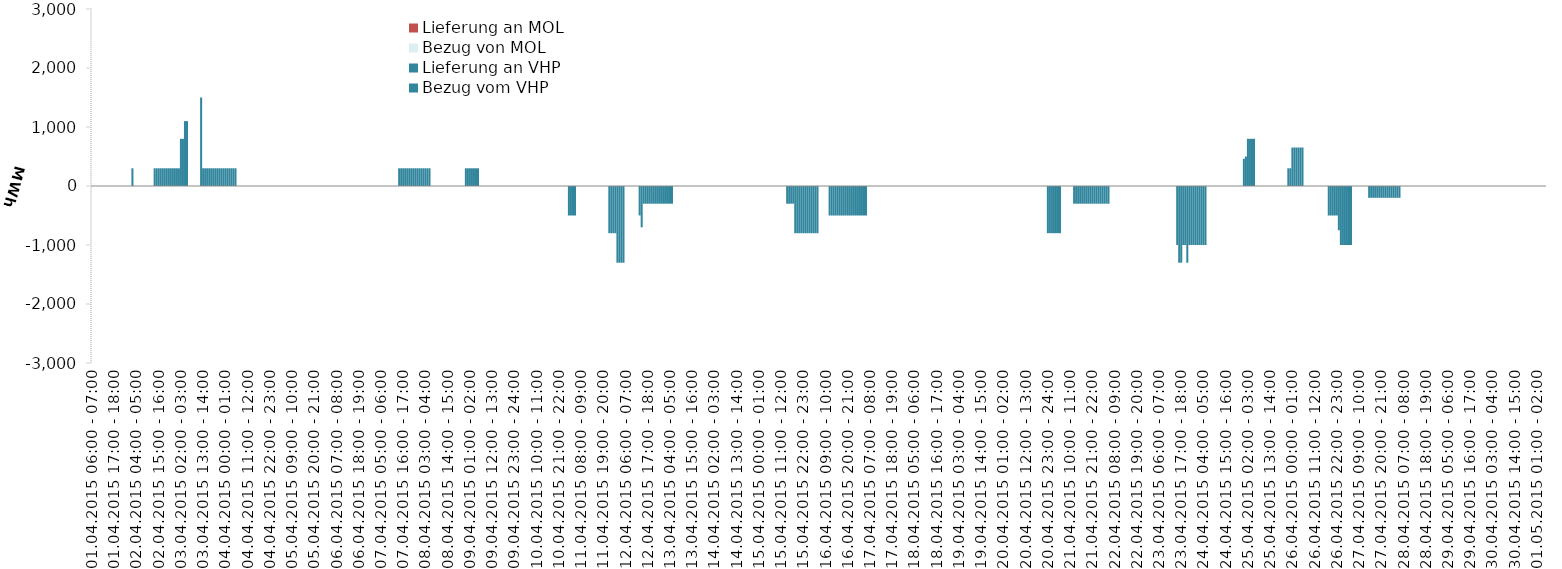
| Category | Bezug vom VHP | Lieferung an VHP | Bezug von MOL | Lieferung an MOL |
|---|---|---|---|---|
| 01.04.2015 06:00 - 07:00 | 0 | 0 | 0 | 0 |
| 01.04.2015 07:00 - 08:00 | 0 | 0 | 0 | 0 |
| 01.04.2015 08:00 - 09:00 | 0 | 0 | 0 | 0 |
| 01.04.2015 09:00 - 10:00 | 0 | 0 | 0 | 0 |
| 01.04.2015 10:00 - 11:00 | 0 | 0 | 0 | 0 |
| 01.04.2015 11:00 - 12:00 | 0 | 0 | 0 | 0 |
| 01.04.2015 12:00 - 13:00 | 0 | 0 | 0 | 0 |
| 01.04.2015 13:00 - 14:00 | 0 | 0 | 0 | 0 |
| 01.04.2015 14:00 - 15:00 | 0 | 0 | 0 | 0 |
| 01.04.2015 15:00 - 16:00 | 0 | 0 | 0 | 0 |
| 01.04.2015 16:00 - 17:00 | 0 | 0 | 0 | 0 |
| 01.04.2015 17:00 - 18:00 | 0 | 0 | 0 | 0 |
| 01.04.2015 18:00 - 19:00 | 0 | 0 | 0 | 0 |
| 01.04.2015 19:00 - 20:00 | 0 | 0 | 0 | 0 |
| 01.04.2015 20:00 - 21:00 | 0 | 0 | 0 | 0 |
| 01.04.2015 21:00 - 22:00 | 0 | 0 | 0 | 0 |
| 01.04.2015 22:00 - 23:00 | 0 | 0 | 0 | 0 |
| 01.04.2015 23:00 - 24:00 | 0 | 0 | 0 | 0 |
| 02.04.2015 00:00 - 01:00 | 0 | 0 | 0 | 0 |
| 02.04.2015 01:00 - 02:00 | 0 | 0 | 0 | 0 |
| 02.04.2015 02:00 - 03:00 | 300 | 0 | 0 | 0 |
| 02.04.2015 03:00 - 04:00 | 0 | 0 | 0 | 0 |
| 02.04.2015 04:00 - 05:00 | 0 | 0 | 0 | 0 |
| 02.04.2015 05:00 - 06:00 | 0 | 0 | 0 | 0 |
| 02.04.2015 06:00 - 07:00 | 0 | 0 | 0 | 0 |
| 02.04.2015 07:00 - 08:00 | 0 | 0 | 0 | 0 |
| 02.04.2015 08:00 - 09:00 | 0 | 0 | 0 | 0 |
| 02.04.2015 09:00 - 10:00 | 0 | 0 | 0 | 0 |
| 02.04.2015 10:00 - 11:00 | 0 | 0 | 0 | 0 |
| 02.04.2015 11:00 - 12:00 | 0 | 0 | 0 | 0 |
| 02.04.2015 12:00 - 13:00 | 0 | 0 | 0 | 0 |
| 02.04.2015 13:00 - 14:00 | 300 | 0 | 0 | 0 |
| 02.04.2015 14:00 - 15:00 | 300 | 0 | 0 | 0 |
| 02.04.2015 15:00 - 16:00 | 300 | 0 | 0 | 0 |
| 02.04.2015 16:00 - 17:00 | 300 | 0 | 0 | 0 |
| 02.04.2015 17:00 - 18:00 | 300 | 0 | 0 | 0 |
| 02.04.2015 18:00 - 19:00 | 300 | 0 | 0 | 0 |
| 02.04.2015 19:00 - 20:00 | 300 | 0 | 0 | 0 |
| 02.04.2015 20:00 - 21:00 | 300 | 0 | 0 | 0 |
| 02.04.2015 21:00 - 22:00 | 300 | 0 | 0 | 0 |
| 02.04.2015 22:00 - 23:00 | 300 | 0 | 0 | 0 |
| 02.04.2015 23:00 - 24:00 | 300 | 0 | 0 | 0 |
| 03.04.2015 00:00 - 01:00 | 300 | 0 | 0 | 0 |
| 03.04.2015 01:00 - 02:00 | 300 | 0 | 0 | 0 |
| 03.04.2015 02:00 - 03:00 | 800 | 0 | 0 | 0 |
| 03.04.2015 03:00 - 04:00 | 800 | 0 | 0 | 0 |
| 03.04.2015 04:00 - 05:00 | 1100 | 0 | 0 | 0 |
| 03.04.2015 05:00 - 06:00 | 1100 | 0 | 0 | 0 |
| 03.04.2015 06:00 - 07:00 | 0 | 0 | 0 | 0 |
| 03.04.2015 07:00 - 08:00 | 0 | 0 | 0 | 0 |
| 03.04.2015 08:00 - 09:00 | 0 | 0 | 0 | 0 |
| 03.04.2015 09:00 - 10:00 | 0 | 0 | 0 | 0 |
| 03.04.2015 10:00 - 11:00 | 0 | 0 | 0 | 0 |
| 03.04.2015 11:00 - 12:00 | 0 | 0 | 0 | 0 |
| 03.04.2015 12:00 - 13:00 | 1500 | 0 | 0 | 0 |
| 03.04.2015 13:00 - 14:00 | 300 | 0 | 0 | 0 |
| 03.04.2015 14:00 - 15:00 | 300 | 0 | 0 | 0 |
| 03.04.2015 15:00 - 16:00 | 300 | 0 | 0 | 0 |
| 03.04.2015 16:00 - 17:00 | 300 | 0 | 0 | 0 |
| 03.04.2015 17:00 - 18:00 | 300 | 0 | 0 | 0 |
| 03.04.2015 18:00 - 19:00 | 300 | 0 | 0 | 0 |
| 03.04.2015 19:00 - 20:00 | 300 | 0 | 0 | 0 |
| 03.04.2015 20:00 - 21:00 | 300 | 0 | 0 | 0 |
| 03.04.2015 21:00 - 22:00 | 300 | 0 | 0 | 0 |
| 03.04.2015 22:00 - 23:00 | 300 | 0 | 0 | 0 |
| 03.04.2015 23:00 - 24:00 | 300 | 0 | 0 | 0 |
| 04.04.2015 00:00 - 01:00 | 300 | 0 | 0 | 0 |
| 04.04.2015 01:00 - 02:00 | 300 | 0 | 0 | 0 |
| 04.04.2015 02:00 - 03:00 | 300 | 0 | 0 | 0 |
| 04.04.2015 03:00 - 04:00 | 300 | 0 | 0 | 0 |
| 04.04.2015 04:00 - 05:00 | 300 | 0 | 0 | 0 |
| 04.04.2015 05:00 - 06:00 | 300 | 0 | 0 | 0 |
| 04.04.2015 06:00 - 07:00 | 0 | 0 | 0 | 0 |
| 04.04.2015 07:00 - 08:00 | 0 | 0 | 0 | 0 |
| 04.04.2015 08:00 - 09:00 | 0 | 0 | 0 | 0 |
| 04.04.2015 09:00 - 10:00 | 0 | 0 | 0 | 0 |
| 04.04.2015 10:00 - 11:00 | 0 | 0 | 0 | 0 |
| 04.04.2015 11:00 - 12:00 | 0 | 0 | 0 | 0 |
| 04.04.2015 12:00 - 13:00 | 0 | 0 | 0 | 0 |
| 04.04.2015 13:00 - 14:00 | 0 | 0 | 0 | 0 |
| 04.04.2015 14:00 - 15:00 | 0 | 0 | 0 | 0 |
| 04.04.2015 15:00 - 16:00 | 0 | 0 | 0 | 0 |
| 04.04.2015 16:00 - 17:00 | 0 | 0 | 0 | 0 |
| 04.04.2015 17:00 - 18:00 | 0 | 0 | 0 | 0 |
| 04.04.2015 18:00 - 19:00 | 0 | 0 | 0 | 0 |
| 04.04.2015 19:00 - 20:00 | 0 | 0 | 0 | 0 |
| 04.04.2015 20:00 - 21:00 | 0 | 0 | 0 | 0 |
| 04.04.2015 21:00 - 22:00 | 0 | 0 | 0 | 0 |
| 04.04.2015 22:00 - 23:00 | 0 | 0 | 0 | 0 |
| 04.04.2015 23:00 - 24:00 | 0 | 0 | 0 | 0 |
| 05.04.2015 00:00 - 01:00 | 0 | 0 | 0 | 0 |
| 05.04.2015 01:00 - 02:00 | 0 | 0 | 0 | 0 |
| 05.04.2015 02:00 - 03:00 | 0 | 0 | 0 | 0 |
| 05.04.2015 03:00 - 04:00 | 0 | 0 | 0 | 0 |
| 05.04.2015 04:00 - 05:00 | 0 | 0 | 0 | 0 |
| 05.04.2015 05:00 - 06:00 | 0 | 0 | 0 | 0 |
| 05.04.2015 06:00 - 07:00 | 0 | 0 | 0 | 0 |
| 05.04.2015 07:00 - 08:00 | 0 | 0 | 0 | 0 |
| 05.04.2015 08:00 - 09:00 | 0 | 0 | 0 | 0 |
| 05.04.2015 09:00 - 10:00 | 0 | 0 | 0 | 0 |
| 05.04.2015 10:00 - 11:00 | 0 | 0 | 0 | 0 |
| 05.04.2015 11:00 - 12:00 | 0 | 0 | 0 | 0 |
| 05.04.2015 12:00 - 13:00 | 0 | 0 | 0 | 0 |
| 05.04.2015 13:00 - 14:00 | 0 | 0 | 0 | 0 |
| 05.04.2015 14:00 - 15:00 | 0 | 0 | 0 | 0 |
| 05.04.2015 15:00 - 16:00 | 0 | 0 | 0 | 0 |
| 05.04.2015 16:00 - 17:00 | 0 | 0 | 0 | 0 |
| 05.04.2015 17:00 - 18:00 | 0 | 0 | 0 | 0 |
| 05.04.2015 18:00 - 19:00 | 0 | 0 | 0 | 0 |
| 05.04.2015 19:00 - 20:00 | 0 | 0 | 0 | 0 |
| 05.04.2015 20:00 - 21:00 | 0 | 0 | 0 | 0 |
| 05.04.2015 21:00 - 22:00 | 0 | 0 | 0 | 0 |
| 05.04.2015 22:00 - 23:00 | 0 | 0 | 0 | 0 |
| 05.04.2015 23:00 - 24:00 | 0 | 0 | 0 | 0 |
| 06.04.2015 00:00 - 01:00 | 0 | 0 | 0 | 0 |
| 06.04.2015 01:00 - 02:00 | 0 | 0 | 0 | 0 |
| 06.04.2015 02:00 - 03:00 | 0 | 0 | 0 | 0 |
| 06.04.2015 03:00 - 04:00 | 0 | 0 | 0 | 0 |
| 06.04.2015 04:00 - 05:00 | 0 | 0 | 0 | 0 |
| 06.04.2015 05:00 - 06:00 | 0 | 0 | 0 | 0 |
| 06.04.2015 06:00 - 07:00 | 0 | 0 | 0 | 0 |
| 06.04.2015 07:00 - 08:00 | 0 | 0 | 0 | 0 |
| 06.04.2015 08:00 - 09:00 | 0 | 0 | 0 | 0 |
| 06.04.2015 09:00 - 10:00 | 0 | 0 | 0 | 0 |
| 06.04.2015 10:00 - 11:00 | 0 | 0 | 0 | 0 |
| 06.04.2015 11:00 - 12:00 | 0 | 0 | 0 | 0 |
| 06.04.2015 12:00 - 13:00 | 0 | 0 | 0 | 0 |
| 06.04.2015 13:00 - 14:00 | 0 | 0 | 0 | 0 |
| 06.04.2015 14:00 - 15:00 | 0 | 0 | 0 | 0 |
| 06.04.2015 15:00 - 16:00 | 0 | 0 | 0 | 0 |
| 06.04.2015 16:00 - 17:00 | 0 | 0 | 0 | 0 |
| 06.04.2015 17:00 - 18:00 | 0 | 0 | 0 | 0 |
| 06.04.2015 18:00 - 19:00 | 0 | 0 | 0 | 0 |
| 06.04.2015 19:00 - 20:00 | 0 | 0 | 0 | 0 |
| 06.04.2015 20:00 - 21:00 | 0 | 0 | 0 | 0 |
| 06.04.2015 21:00 - 22:00 | 0 | 0 | 0 | 0 |
| 06.04.2015 22:00 - 23:00 | 0 | 0 | 0 | 0 |
| 06.04.2015 23:00 - 24:00 | 0 | 0 | 0 | 0 |
| 07.04.2015 00:00 - 01:00 | 0 | 0 | 0 | 0 |
| 07.04.2015 01:00 - 02:00 | 0 | 0 | 0 | 0 |
| 07.04.2015 02:00 - 03:00 | 0 | 0 | 0 | 0 |
| 07.04.2015 03:00 - 04:00 | 0 | 0 | 0 | 0 |
| 07.04.2015 04:00 - 05:00 | 0 | 0 | 0 | 0 |
| 07.04.2015 05:00 - 06:00 | 0 | 0 | 0 | 0 |
| 07.04.2015 06:00 - 07:00 | 0 | 0 | 0 | 0 |
| 07.04.2015 07:00 - 08:00 | 0 | 0 | 0 | 0 |
| 07.04.2015 08:00 - 09:00 | 0 | 0 | 0 | 0 |
| 07.04.2015 09:00 - 10:00 | 0 | 0 | 0 | 0 |
| 07.04.2015 10:00 - 11:00 | 0 | 0 | 0 | 0 |
| 07.04.2015 11:00 - 12:00 | 0 | 0 | 0 | 0 |
| 07.04.2015 12:00 - 13:00 | 0 | 0 | 0 | 0 |
| 07.04.2015 13:00 - 14:00 | 0 | 0 | 0 | 0 |
| 07.04.2015 14:00 - 15:00 | 300 | 0 | 0 | 0 |
| 07.04.2015 15:00 - 16:00 | 300 | 0 | 0 | 0 |
| 07.04.2015 16:00 - 17:00 | 300 | 0 | 0 | 0 |
| 07.04.2015 17:00 - 18:00 | 300 | 0 | 0 | 0 |
| 07.04.2015 18:00 - 19:00 | 300 | 0 | 0 | 0 |
| 07.04.2015 19:00 - 20:00 | 300 | 0 | 0 | 0 |
| 07.04.2015 20:00 - 21:00 | 300 | 0 | 0 | 0 |
| 07.04.2015 21:00 - 22:00 | 300 | 0 | 0 | 0 |
| 07.04.2015 22:00 - 23:00 | 300 | 0 | 0 | 0 |
| 07.04.2015 23:00 - 24:00 | 300 | 0 | 0 | 0 |
| 08.04.2015 00:00 - 01:00 | 300 | 0 | 0 | 0 |
| 08.04.2015 01:00 - 02:00 | 300 | 0 | 0 | 0 |
| 08.04.2015 02:00 - 03:00 | 300 | 0 | 0 | 0 |
| 08.04.2015 03:00 - 04:00 | 300 | 0 | 0 | 0 |
| 08.04.2015 04:00 - 05:00 | 300 | 0 | 0 | 0 |
| 08.04.2015 05:00 - 06:00 | 300 | 0 | 0 | 0 |
| 08.04.2015 06:00 - 07:00 | 0 | 0 | 0 | 0 |
| 08.04.2015 07:00 - 08:00 | 0 | 0 | 0 | 0 |
| 08.04.2015 08:00 - 09:00 | 0 | 0 | 0 | 0 |
| 08.04.2015 09:00 - 10:00 | 0 | 0 | 0 | 0 |
| 08.04.2015 10:00 - 11:00 | 0 | 0 | 0 | 0 |
| 08.04.2015 11:00 - 12:00 | 0 | 0 | 0 | 0 |
| 08.04.2015 12:00 - 13:00 | 0 | 0 | 0 | 0 |
| 08.04.2015 13:00 - 14:00 | 0 | 0 | 0 | 0 |
| 08.04.2015 14:00 - 15:00 | 0 | 0 | 0 | 0 |
| 08.04.2015 15:00 - 16:00 | 0 | 0 | 0 | 0 |
| 08.04.2015 16:00 - 17:00 | 0 | 0 | 0 | 0 |
| 08.04.2015 17:00 - 18:00 | 0 | 0 | 0 | 0 |
| 08.04.2015 18:00 - 19:00 | 0 | 0 | 0 | 0 |
| 08.04.2015 19:00 - 20:00 | 0 | 0 | 0 | 0 |
| 08.04.2015 20:00 - 21:00 | 0 | 0 | 0 | 0 |
| 08.04.2015 21:00 - 22:00 | 0 | 0 | 0 | 0 |
| 08.04.2015 22:00 - 23:00 | 0 | 0 | 0 | 0 |
| 08.04.2015 23:00 - 24:00 | 300 | 0 | 0 | 0 |
| 09.04.2015 00:00 - 01:00 | 300 | 0 | 0 | 0 |
| 09.04.2015 01:00 - 02:00 | 300 | 0 | 0 | 0 |
| 09.04.2015 02:00 - 03:00 | 300 | 0 | 0 | 0 |
| 09.04.2015 03:00 - 04:00 | 300 | 0 | 0 | 0 |
| 09.04.2015 04:00 - 05:00 | 300 | 0 | 0 | 0 |
| 09.04.2015 05:00 - 06:00 | 300 | 0 | 0 | 0 |
| 09.04.2015 06:00 - 07:00 | 0 | 0 | 0 | 0 |
| 09.04.2015 07:00 - 08:00 | 0 | 0 | 0 | 0 |
| 09.04.2015 08:00 - 09:00 | 0 | 0 | 0 | 0 |
| 09.04.2015 09:00 - 10:00 | 0 | 0 | 0 | 0 |
| 09.04.2015 10:00 - 11:00 | 0 | 0 | 0 | 0 |
| 09.04.2015 11:00 - 12:00 | 0 | 0 | 0 | 0 |
| 09.04.2015 12:00 - 13:00 | 0 | 0 | 0 | 0 |
| 09.04.2015 13:00 - 14:00 | 0 | 0 | 0 | 0 |
| 09.04.2015 14:00 - 15:00 | 0 | 0 | 0 | 0 |
| 09.04.2015 15:00 - 16:00 | 0 | 0 | 0 | 0 |
| 09.04.2015 16:00 - 17:00 | 0 | 0 | 0 | 0 |
| 09.04.2015 17:00 - 18:00 | 0 | 0 | 0 | 0 |
| 09.04.2015 18:00 - 19:00 | 0 | 0 | 0 | 0 |
| 09.04.2015 19:00 - 20:00 | 0 | 0 | 0 | 0 |
| 09.04.2015 20:00 - 21:00 | 0 | 0 | 0 | 0 |
| 09.04.2015 21:00 - 22:00 | 0 | 0 | 0 | 0 |
| 09.04.2015 22:00 - 23:00 | 0 | 0 | 0 | 0 |
| 09.04.2015 23:00 - 24:00 | 0 | 0 | 0 | 0 |
| 10.04.2015 00:00 - 01:00 | 0 | 0 | 0 | 0 |
| 10.04.2015 01:00 - 02:00 | 0 | 0 | 0 | 0 |
| 10.04.2015 02:00 - 03:00 | 0 | 0 | 0 | 0 |
| 10.04.2015 03:00 - 04:00 | 0 | 0 | 0 | 0 |
| 10.04.2015 04:00 - 05:00 | 0 | 0 | 0 | 0 |
| 10.04.2015 05:00 - 06:00 | 0 | 0 | 0 | 0 |
| 10.04.2015 06:00 - 07:00 | 0 | 0 | 0 | 0 |
| 10.04.2015 07:00 - 08:00 | 0 | 0 | 0 | 0 |
| 10.04.2015 08:00 - 09:00 | 0 | 0 | 0 | 0 |
| 10.04.2015 09:00 - 10:00 | 0 | 0 | 0 | 0 |
| 10.04.2015 10:00 - 11:00 | 0 | 0 | 0 | 0 |
| 10.04.2015 11:00 - 12:00 | 0 | 0 | 0 | 0 |
| 10.04.2015 12:00 - 13:00 | 0 | 0 | 0 | 0 |
| 10.04.2015 13:00 - 14:00 | 0 | 0 | 0 | 0 |
| 10.04.2015 14:00 - 15:00 | 0 | 0 | 0 | 0 |
| 10.04.2015 15:00 - 16:00 | 0 | 0 | 0 | 0 |
| 10.04.2015 16:00 - 17:00 | 0 | 0 | 0 | 0 |
| 10.04.2015 17:00 - 18:00 | 0 | 0 | 0 | 0 |
| 10.04.2015 18:00 - 19:00 | 0 | 0 | 0 | 0 |
| 10.04.2015 19:00 - 20:00 | 0 | 0 | 0 | 0 |
| 10.04.2015 20:00 - 21:00 | 0 | 0 | 0 | 0 |
| 10.04.2015 21:00 - 22:00 | 0 | 0 | 0 | 0 |
| 10.04.2015 22:00 - 23:00 | 0 | 0 | 0 | 0 |
| 10.04.2015 23:00 - 24:00 | 0 | 0 | 0 | 0 |
| 11.04.2015 00:00 - 01:00 | 0 | 0 | 0 | 0 |
| 11.04.2015 01:00 - 02:00 | 0 | 0 | 0 | 0 |
| 11.04.2015 02:00 - 03:00 | 0 | -500 | 0 | 0 |
| 11.04.2015 03:00 - 04:00 | 0 | -500 | 0 | 0 |
| 11.04.2015 04:00 - 05:00 | 0 | -500 | 0 | 0 |
| 11.04.2015 05:00 - 06:00 | 0 | -500 | 0 | 0 |
| 11.04.2015 06:00 - 07:00 | 0 | 0 | 0 | 0 |
| 11.04.2015 07:00 - 08:00 | 0 | 0 | 0 | 0 |
| 11.04.2015 08:00 - 09:00 | 0 | 0 | 0 | 0 |
| 11.04.2015 09:00 - 10:00 | 0 | 0 | 0 | 0 |
| 11.04.2015 10:00 - 11:00 | 0 | 0 | 0 | 0 |
| 11.04.2015 11:00 - 12:00 | 0 | 0 | 0 | 0 |
| 11.04.2015 12:00 - 13:00 | 0 | 0 | 0 | 0 |
| 11.04.2015 13:00 - 14:00 | 0 | 0 | 0 | 0 |
| 11.04.2015 14:00 - 15:00 | 0 | 0 | 0 | 0 |
| 11.04.2015 15:00 - 16:00 | 0 | 0 | 0 | 0 |
| 11.04.2015 16:00 - 17:00 | 0 | 0 | 0 | 0 |
| 11.04.2015 17:00 - 18:00 | 0 | 0 | 0 | 0 |
| 11.04.2015 18:00 - 19:00 | 0 | 0 | 0 | 0 |
| 11.04.2015 19:00 - 20:00 | 0 | 0 | 0 | 0 |
| 11.04.2015 20:00 - 21:00 | 0 | 0 | 0 | 0 |
| 11.04.2015 21:00 - 22:00 | 0 | 0 | 0 | 0 |
| 11.04.2015 22:00 - 23:00 | 0 | -800 | 0 | 0 |
| 11.04.2015 23:00 - 24:00 | 0 | -800 | 0 | 0 |
| 12.04.2015 00:00 - 01:00 | 0 | -800 | 0 | 0 |
| 12.04.2015 01:00 - 02:00 | 0 | -800 | 0 | 0 |
| 12.04.2015 02:00 - 03:00 | 0 | -1300 | 0 | 0 |
| 12.04.2015 03:00 - 04:00 | 0 | -1300 | 0 | 0 |
| 12.04.2015 04:00 - 05:00 | 0 | -1300 | 0 | 0 |
| 12.04.2015 05:00 - 06:00 | 0 | -1300 | 0 | 0 |
| 12.04.2015 06:00 - 07:00 | 0 | 0 | 0 | 0 |
| 12.04.2015 07:00 - 08:00 | 0 | 0 | 0 | 0 |
| 12.04.2015 08:00 - 09:00 | 0 | 0 | 0 | 0 |
| 12.04.2015 09:00 - 10:00 | 0 | 0 | 0 | 0 |
| 12.04.2015 10:00 - 11:00 | 0 | 0 | 0 | 0 |
| 12.04.2015 11:00 - 12:00 | 0 | 0 | 0 | 0 |
| 12.04.2015 12:00 - 13:00 | 0 | 0 | 0 | 0 |
| 12.04.2015 13:00 - 14:00 | 0 | -499 | 0 | 0 |
| 12.04.2015 14:00 - 15:00 | 0 | -700 | 0 | 0 |
| 12.04.2015 15:00 - 16:00 | 0 | -300 | 0 | 0 |
| 12.04.2015 16:00 - 17:00 | 0 | -300 | 0 | 0 |
| 12.04.2015 17:00 - 18:00 | 0 | -300 | 0 | 0 |
| 12.04.2015 18:00 - 19:00 | 0 | -300 | 0 | 0 |
| 12.04.2015 19:00 - 20:00 | 0 | -300 | 0 | 0 |
| 12.04.2015 20:00 - 21:00 | 0 | -300 | 0 | 0 |
| 12.04.2015 21:00 - 22:00 | 0 | -300 | 0 | 0 |
| 12.04.2015 22:00 - 23:00 | 0 | -300 | 0 | 0 |
| 12.04.2015 23:00 - 24:00 | 0 | -300 | 0 | 0 |
| 13.04.2015 00:00 - 01:00 | 0 | -300 | 0 | 0 |
| 13.04.2015 01:00 - 02:00 | 0 | -300 | 0 | 0 |
| 13.04.2015 02:00 - 03:00 | 0 | -300 | 0 | 0 |
| 13.04.2015 03:00 - 04:00 | 0 | -300 | 0 | 0 |
| 13.04.2015 04:00 - 05:00 | 0 | -300 | 0 | 0 |
| 13.04.2015 05:00 - 06:00 | 0 | -300 | 0 | 0 |
| 13.04.2015 06:00 - 07:00 | 0 | 0 | 0 | 0 |
| 13.04.2015 07:00 - 08:00 | 0 | 0 | 0 | 0 |
| 13.04.2015 08:00 - 09:00 | 0 | 0 | 0 | 0 |
| 13.04.2015 09:00 - 10:00 | 0 | 0 | 0 | 0 |
| 13.04.2015 10:00 - 11:00 | 0 | 0 | 0 | 0 |
| 13.04.2015 11:00 - 12:00 | 0 | 0 | 0 | 0 |
| 13.04.2015 12:00 - 13:00 | 0 | 0 | 0 | 0 |
| 13.04.2015 13:00 - 14:00 | 0 | 0 | 0 | 0 |
| 13.04.2015 14:00 - 15:00 | 0 | 0 | 0 | 0 |
| 13.04.2015 15:00 - 16:00 | 0 | 0 | 0 | 0 |
| 13.04.2015 16:00 - 17:00 | 0 | 0 | 0 | 0 |
| 13.04.2015 17:00 - 18:00 | 0 | 0 | 0 | 0 |
| 13.04.2015 18:00 - 19:00 | 0 | 0 | 0 | 0 |
| 13.04.2015 19:00 - 20:00 | 0 | 0 | 0 | 0 |
| 13.04.2015 20:00 - 21:00 | 0 | 0 | 0 | 0 |
| 13.04.2015 21:00 - 22:00 | 0 | 0 | 0 | 0 |
| 13.04.2015 22:00 - 23:00 | 0 | 0 | 0 | 0 |
| 13.04.2015 23:00 - 24:00 | 0 | 0 | 0 | 0 |
| 14.04.2015 00:00 - 01:00 | 0 | 0 | 0 | 0 |
| 14.04.2015 01:00 - 02:00 | 0 | 0 | 0 | 0 |
| 14.04.2015 02:00 - 03:00 | 0 | 0 | 0 | 0 |
| 14.04.2015 03:00 - 04:00 | 0 | 0 | 0 | 0 |
| 14.04.2015 04:00 - 05:00 | 0 | 0 | 0 | 0 |
| 14.04.2015 05:00 - 06:00 | 0 | 0 | 0 | 0 |
| 14.04.2015 06:00 - 07:00 | 0 | 0 | 0 | 0 |
| 14.04.2015 07:00 - 08:00 | 0 | 0 | 0 | 0 |
| 14.04.2015 08:00 - 09:00 | 0 | 0 | 0 | 0 |
| 14.04.2015 09:00 - 10:00 | 0 | 0 | 0 | 0 |
| 14.04.2015 10:00 - 11:00 | 0 | 0 | 0 | 0 |
| 14.04.2015 11:00 - 12:00 | 0 | 0 | 0 | 0 |
| 14.04.2015 12:00 - 13:00 | 0 | 0 | 0 | 0 |
| 14.04.2015 13:00 - 14:00 | 0 | 0 | 0 | 0 |
| 14.04.2015 14:00 - 15:00 | 0 | 0 | 0 | 0 |
| 14.04.2015 15:00 - 16:00 | 0 | 0 | 0 | 0 |
| 14.04.2015 16:00 - 17:00 | 0 | 0 | 0 | 0 |
| 14.04.2015 17:00 - 18:00 | 0 | 0 | 0 | 0 |
| 14.04.2015 18:00 - 19:00 | 0 | 0 | 0 | 0 |
| 14.04.2015 19:00 - 20:00 | 0 | 0 | 0 | 0 |
| 14.04.2015 20:00 - 21:00 | 0 | 0 | 0 | 0 |
| 14.04.2015 21:00 - 22:00 | 0 | 0 | 0 | 0 |
| 14.04.2015 22:00 - 23:00 | 0 | 0 | 0 | 0 |
| 14.04.2015 23:00 - 24:00 | 0 | 0 | 0 | 0 |
| 15.04.2015 00:00 - 01:00 | 0 | 0 | 0 | 0 |
| 15.04.2015 01:00 - 02:00 | 0 | 0 | 0 | 0 |
| 15.04.2015 02:00 - 03:00 | 0 | 0 | 0 | 0 |
| 15.04.2015 03:00 - 04:00 | 0 | 0 | 0 | 0 |
| 15.04.2015 04:00 - 05:00 | 0 | 0 | 0 | 0 |
| 15.04.2015 05:00 - 06:00 | 0 | 0 | 0 | 0 |
| 15.04.2015 06:00 - 07:00 | 0 | 0 | 0 | 0 |
| 15.04.2015 07:00 - 08:00 | 0 | 0 | 0 | 0 |
| 15.04.2015 08:00 - 09:00 | 0 | 0 | 0 | 0 |
| 15.04.2015 09:00 - 10:00 | 0 | 0 | 0 | 0 |
| 15.04.2015 10:00 - 11:00 | 0 | 0 | 0 | 0 |
| 15.04.2015 11:00 - 12:00 | 0 | 0 | 0 | 0 |
| 15.04.2015 12:00 - 13:00 | 0 | 0 | 0 | 0 |
| 15.04.2015 13:00 - 14:00 | 0 | 0 | 0 | 0 |
| 15.04.2015 14:00 - 15:00 | 0 | -300 | 0 | 0 |
| 15.04.2015 15:00 - 16:00 | 0 | -300 | 0 | 0 |
| 15.04.2015 16:00 - 17:00 | 0 | -300 | 0 | 0 |
| 15.04.2015 17:00 - 18:00 | 0 | -300 | 0 | 0 |
| 15.04.2015 18:00 - 19:00 | 0 | -800 | 0 | 0 |
| 15.04.2015 19:00 - 20:00 | 0 | -800 | 0 | 0 |
| 15.04.2015 20:00 - 21:00 | 0 | -800 | 0 | 0 |
| 15.04.2015 21:00 - 22:00 | 0 | -800 | 0 | 0 |
| 15.04.2015 22:00 - 23:00 | 0 | -800 | 0 | 0 |
| 15.04.2015 23:00 - 24:00 | 0 | -800 | 0 | 0 |
| 16.04.2015 00:00 - 01:00 | 0 | -800 | 0 | 0 |
| 16.04.2015 01:00 - 02:00 | 0 | -800 | 0 | 0 |
| 16.04.2015 02:00 - 03:00 | 0 | -800 | 0 | 0 |
| 16.04.2015 03:00 - 04:00 | 0 | -800 | 0 | 0 |
| 16.04.2015 04:00 - 05:00 | 0 | -800 | 0 | 0 |
| 16.04.2015 05:00 - 06:00 | 0 | -800 | 0 | 0 |
| 16.04.2015 06:00 - 07:00 | 0 | 0 | 0 | 0 |
| 16.04.2015 07:00 - 08:00 | 0 | 0 | 0 | 0 |
| 16.04.2015 08:00 - 09:00 | 0 | 0 | 0 | 0 |
| 16.04.2015 09:00 - 10:00 | 0 | 0 | 0 | 0 |
| 16.04.2015 10:00 - 11:00 | 0 | 0 | 0 | 0 |
| 16.04.2015 11:00 - 12:00 | 0 | -500 | 0 | 0 |
| 16.04.2015 12:00 - 13:00 | 0 | -500 | 0 | 0 |
| 16.04.2015 13:00 - 14:00 | 0 | -500 | 0 | 0 |
| 16.04.2015 14:00 - 15:00 | 0 | -500 | 0 | 0 |
| 16.04.2015 15:00 - 16:00 | 0 | -500 | 0 | 0 |
| 16.04.2015 16:00 - 17:00 | 0 | -500 | 0 | 0 |
| 16.04.2015 17:00 - 18:00 | 0 | -500 | 0 | 0 |
| 16.04.2015 18:00 - 19:00 | 0 | -500 | 0 | 0 |
| 16.04.2015 19:00 - 20:00 | 0 | -500 | 0 | 0 |
| 16.04.2015 20:00 - 21:00 | 0 | -500 | 0 | 0 |
| 16.04.2015 21:00 - 22:00 | 0 | -500 | 0 | 0 |
| 16.04.2015 22:00 - 23:00 | 0 | -500 | 0 | 0 |
| 16.04.2015 23:00 - 24:00 | 0 | -500 | 0 | 0 |
| 17.04.2015 00:00 - 01:00 | 0 | -500 | 0 | 0 |
| 17.04.2015 01:00 - 02:00 | 0 | -500 | 0 | 0 |
| 17.04.2015 02:00 - 03:00 | 0 | -500 | 0 | 0 |
| 17.04.2015 03:00 - 04:00 | 0 | -500 | 0 | 0 |
| 17.04.2015 04:00 - 05:00 | 0 | -500 | 0 | 0 |
| 17.04.2015 05:00 - 06:00 | 0 | -500 | 0 | 0 |
| 17.04.2015 06:00 - 07:00 | 0 | 0 | 0 | 0 |
| 17.04.2015 07:00 - 08:00 | 0 | 0 | 0 | 0 |
| 17.04.2015 08:00 - 09:00 | 0 | 0 | 0 | 0 |
| 17.04.2015 09:00 - 10:00 | 0 | 0 | 0 | 0 |
| 17.04.2015 10:00 - 11:00 | 0 | 0 | 0 | 0 |
| 17.04.2015 11:00 - 12:00 | 0 | 0 | 0 | 0 |
| 17.04.2015 12:00 - 13:00 | 0 | 0 | 0 | 0 |
| 17.04.2015 13:00 - 14:00 | 0 | 0 | 0 | 0 |
| 17.04.2015 14:00 - 15:00 | 0 | 0 | 0 | 0 |
| 17.04.2015 15:00 - 16:00 | 0 | 0 | 0 | 0 |
| 17.04.2015 16:00 - 17:00 | 0 | 0 | 0 | 0 |
| 17.04.2015 17:00 - 18:00 | 0 | 0 | 0 | 0 |
| 17.04.2015 18:00 - 19:00 | 0 | 0 | 0 | 0 |
| 17.04.2015 19:00 - 20:00 | 0 | 0 | 0 | 0 |
| 17.04.2015 20:00 - 21:00 | 0 | 0 | 0 | 0 |
| 17.04.2015 21:00 - 22:00 | 0 | 0 | 0 | 0 |
| 17.04.2015 22:00 - 23:00 | 0 | 0 | 0 | 0 |
| 17.04.2015 23:00 - 24:00 | 0 | 0 | 0 | 0 |
| 18.04.2015 00:00 - 01:00 | 0 | 0 | 0 | 0 |
| 18.04.2015 01:00 - 02:00 | 0 | 0 | 0 | 0 |
| 18.04.2015 02:00 - 03:00 | 0 | 0 | 0 | 0 |
| 18.04.2015 03:00 - 04:00 | 0 | 0 | 0 | 0 |
| 18.04.2015 04:00 - 05:00 | 0 | 0 | 0 | 0 |
| 18.04.2015 05:00 - 06:00 | 0 | 0 | 0 | 0 |
| 18.04.2015 06:00 - 07:00 | 0 | 0 | 0 | 0 |
| 18.04.2015 07:00 - 08:00 | 0 | 0 | 0 | 0 |
| 18.04.2015 08:00 - 09:00 | 0 | 0 | 0 | 0 |
| 18.04.2015 09:00 - 10:00 | 0 | 0 | 0 | 0 |
| 18.04.2015 10:00 - 11:00 | 0 | 0 | 0 | 0 |
| 18.04.2015 11:00 - 12:00 | 0 | 0 | 0 | 0 |
| 18.04.2015 12:00 - 13:00 | 0 | 0 | 0 | 0 |
| 18.04.2015 13:00 - 14:00 | 0 | 0 | 0 | 0 |
| 18.04.2015 14:00 - 15:00 | 0 | 0 | 0 | 0 |
| 18.04.2015 15:00 - 16:00 | 0 | 0 | 0 | 0 |
| 18.04.2015 16:00 - 17:00 | 0 | 0 | 0 | 0 |
| 18.04.2015 17:00 - 18:00 | 0 | 0 | 0 | 0 |
| 18.04.2015 18:00 - 19:00 | 0 | 0 | 0 | 0 |
| 18.04.2015 19:00 - 20:00 | 0 | 0 | 0 | 0 |
| 18.04.2015 20:00 - 21:00 | 0 | 0 | 0 | 0 |
| 18.04.2015 21:00 - 22:00 | 0 | 0 | 0 | 0 |
| 18.04.2015 22:00 - 23:00 | 0 | 0 | 0 | 0 |
| 18.04.2015 23:00 - 24:00 | 0 | 0 | 0 | 0 |
| 19.04.2015 00:00 - 01:00 | 0 | 0 | 0 | 0 |
| 19.04.2015 01:00 - 02:00 | 0 | 0 | 0 | 0 |
| 19.04.2015 02:00 - 03:00 | 0 | 0 | 0 | 0 |
| 19.04.2015 03:00 - 04:00 | 0 | 0 | 0 | 0 |
| 19.04.2015 04:00 - 05:00 | 0 | 0 | 0 | 0 |
| 19.04.2015 05:00 - 06:00 | 0 | 0 | 0 | 0 |
| 19.04.2015 06:00 - 07:00 | 0 | 0 | 0 | 0 |
| 19.04.2015 07:00 - 08:00 | 0 | 0 | 0 | 0 |
| 19.04.2015 08:00 - 09:00 | 0 | 0 | 0 | 0 |
| 19.04.2015 09:00 - 10:00 | 0 | 0 | 0 | 0 |
| 19.04.2015 10:00 - 11:00 | 0 | 0 | 0 | 0 |
| 19.04.2015 11:00 - 12:00 | 0 | 0 | 0 | 0 |
| 19.04.2015 12:00 - 13:00 | 0 | 0 | 0 | 0 |
| 19.04.2015 13:00 - 14:00 | 0 | 0 | 0 | 0 |
| 19.04.2015 14:00 - 15:00 | 0 | 0 | 0 | 0 |
| 19.04.2015 15:00 - 16:00 | 0 | 0 | 0 | 0 |
| 19.04.2015 16:00 - 17:00 | 0 | 0 | 0 | 0 |
| 19.04.2015 17:00 - 18:00 | 0 | 0 | 0 | 0 |
| 19.04.2015 18:00 - 19:00 | 0 | 0 | 0 | 0 |
| 19.04.2015 19:00 - 20:00 | 0 | 0 | 0 | 0 |
| 19.04.2015 20:00 - 21:00 | 0 | 0 | 0 | 0 |
| 19.04.2015 21:00 - 22:00 | 0 | 0 | 0 | 0 |
| 19.04.2015 22:00 - 23:00 | 0 | 0 | 0 | 0 |
| 19.04.2015 23:00 - 24:00 | 0 | 0 | 0 | 0 |
| 20.04.2015 00:00 - 01:00 | 0 | 0 | 0 | 0 |
| 20.04.2015 01:00 - 02:00 | 0 | 0 | 0 | 0 |
| 20.04.2015 02:00 - 03:00 | 0 | 0 | 0 | 0 |
| 20.04.2015 03:00 - 04:00 | 0 | 0 | 0 | 0 |
| 20.04.2015 04:00 - 05:00 | 0 | 0 | 0 | 0 |
| 20.04.2015 05:00 - 06:00 | 0 | 0 | 0 | 0 |
| 20.04.2015 06:00 - 07:00 | 0 | 0 | 0 | 0 |
| 20.04.2015 07:00 - 08:00 | 0 | 0 | 0 | 0 |
| 20.04.2015 08:00 - 09:00 | 0 | 0 | 0 | 0 |
| 20.04.2015 09:00 - 10:00 | 0 | 0 | 0 | 0 |
| 20.04.2015 10:00 - 11:00 | 0 | 0 | 0 | 0 |
| 20.04.2015 11:00 - 12:00 | 0 | 0 | 0 | 0 |
| 20.04.2015 12:00 - 13:00 | 0 | 0 | 0 | 0 |
| 20.04.2015 13:00 - 14:00 | 0 | 0 | 0 | 0 |
| 20.04.2015 14:00 - 15:00 | 0 | 0 | 0 | 0 |
| 20.04.2015 15:00 - 16:00 | 0 | 0 | 0 | 0 |
| 20.04.2015 16:00 - 17:00 | 0 | 0 | 0 | 0 |
| 20.04.2015 17:00 - 18:00 | 0 | 0 | 0 | 0 |
| 20.04.2015 18:00 - 19:00 | 0 | 0 | 0 | 0 |
| 20.04.2015 19:00 - 20:00 | 0 | 0 | 0 | 0 |
| 20.04.2015 20:00 - 21:00 | 0 | 0 | 0 | 0 |
| 20.04.2015 21:00 - 22:00 | 0 | 0 | 0 | 0 |
| 20.04.2015 22:00 - 23:00 | 0 | 0 | 0 | 0 |
| 20.04.2015 23:00 - 24:00 | 0 | -800 | 0 | 0 |
| 21.04.2015 00:00 - 01:00 | 0 | -800 | 0 | 0 |
| 21.04.2015 01:00 - 02:00 | 0 | -800 | 0 | 0 |
| 21.04.2015 02:00 - 03:00 | 0 | -800 | 0 | 0 |
| 21.04.2015 03:00 - 04:00 | 0 | -800 | 0 | 0 |
| 21.04.2015 04:00 - 05:00 | 0 | -800 | 0 | 0 |
| 21.04.2015 05:00 - 06:00 | 0 | -800 | 0 | 0 |
| 21.04.2015 06:00 - 07:00 | 0 | 0 | 0 | 0 |
| 21.04.2015 07:00 - 08:00 | 0 | 0 | 0 | 0 |
| 21.04.2015 08:00 - 09:00 | 0 | 0 | 0 | 0 |
| 21.04.2015 09:00 - 10:00 | 0 | 0 | 0 | 0 |
| 21.04.2015 10:00 - 11:00 | 0 | 0 | 0 | 0 |
| 21.04.2015 11:00 - 12:00 | 0 | 0 | 0 | 0 |
| 21.04.2015 12:00 - 13:00 | 0 | -300 | 0 | 0 |
| 21.04.2015 13:00 - 14:00 | 0 | -300 | 0 | 0 |
| 21.04.2015 14:00 - 15:00 | 0 | -300 | 0 | 0 |
| 21.04.2015 15:00 - 16:00 | 0 | -300 | 0 | 0 |
| 21.04.2015 16:00 - 17:00 | 0 | -300 | 0 | 0 |
| 21.04.2015 17:00 - 18:00 | 0 | -300 | 0 | 0 |
| 21.04.2015 18:00 - 19:00 | 0 | -300 | 0 | 0 |
| 21.04.2015 19:00 - 20:00 | 0 | -300 | 0 | 0 |
| 21.04.2015 20:00 - 21:00 | 0 | -300 | 0 | 0 |
| 21.04.2015 21:00 - 22:00 | 0 | -300 | 0 | 0 |
| 21.04.2015 22:00 - 23:00 | 0 | -300 | 0 | 0 |
| 21.04.2015 23:00 - 24:00 | 0 | -300 | 0 | 0 |
| 22.04.2015 00:00 - 01:00 | 0 | -300 | 0 | 0 |
| 22.04.2015 01:00 - 02:00 | 0 | -300 | 0 | 0 |
| 22.04.2015 02:00 - 03:00 | 0 | -300 | 0 | 0 |
| 22.04.2015 03:00 - 04:00 | 0 | -300 | 0 | 0 |
| 22.04.2015 04:00 - 05:00 | 0 | -300 | 0 | 0 |
| 22.04.2015 05:00 - 06:00 | 0 | -300 | 0 | 0 |
| 22.04.2015 06:00 - 07:00 | 0 | 0 | 0 | 0 |
| 22.04.2015 07:00 - 08:00 | 0 | 0 | 0 | 0 |
| 22.04.2015 08:00 - 09:00 | 0 | 0 | 0 | 0 |
| 22.04.2015 09:00 - 10:00 | 0 | 0 | 0 | 0 |
| 22.04.2015 10:00 - 11:00 | 0 | 0 | 0 | 0 |
| 22.04.2015 11:00 - 12:00 | 0 | 0 | 0 | 0 |
| 22.04.2015 12:00 - 13:00 | 0 | 0 | 0 | 0 |
| 22.04.2015 13:00 - 14:00 | 0 | 0 | 0 | 0 |
| 22.04.2015 14:00 - 15:00 | 0 | 0 | 0 | 0 |
| 22.04.2015 15:00 - 16:00 | 0 | 0 | 0 | 0 |
| 22.04.2015 16:00 - 17:00 | 0 | 0 | 0 | 0 |
| 22.04.2015 17:00 - 18:00 | 0 | 0 | 0 | 0 |
| 22.04.2015 18:00 - 19:00 | 0 | 0 | 0 | 0 |
| 22.04.2015 19:00 - 20:00 | 0 | 0 | 0 | 0 |
| 22.04.2015 20:00 - 21:00 | 0 | 0 | 0 | 0 |
| 22.04.2015 21:00 - 22:00 | 0 | 0 | 0 | 0 |
| 22.04.2015 22:00 - 23:00 | 0 | 0 | 0 | 0 |
| 22.04.2015 23:00 - 24:00 | 0 | 0 | 0 | 0 |
| 23.04.2015 00:00 - 01:00 | 0 | 0 | 0 | 0 |
| 23.04.2015 01:00 - 02:00 | 0 | 0 | 0 | 0 |
| 23.04.2015 02:00 - 03:00 | 0 | 0 | 0 | 0 |
| 23.04.2015 03:00 - 04:00 | 0 | 0 | 0 | 0 |
| 23.04.2015 04:00 - 05:00 | 0 | 0 | 0 | 0 |
| 23.04.2015 05:00 - 06:00 | 0 | 0 | 0 | 0 |
| 23.04.2015 06:00 - 07:00 | 0 | 0 | 0 | 0 |
| 23.04.2015 07:00 - 08:00 | 0 | 0 | 0 | 0 |
| 23.04.2015 08:00 - 09:00 | 0 | 0 | 0 | 0 |
| 23.04.2015 09:00 - 10:00 | 0 | 0 | 0 | 0 |
| 23.04.2015 10:00 - 11:00 | 0 | 0 | 0 | 0 |
| 23.04.2015 11:00 - 12:00 | 0 | 0 | 0 | 0 |
| 23.04.2015 12:00 - 13:00 | 0 | 0 | 0 | 0 |
| 23.04.2015 13:00 - 14:00 | 0 | 0 | 0 | 0 |
| 23.04.2015 14:00 - 15:00 | 0 | 0 | 0 | 0 |
| 23.04.2015 15:00 - 16:00 | 0 | -1000 | 0 | 0 |
| 23.04.2015 16:00 - 17:00 | 0 | -1300 | 0 | 0 |
| 23.04.2015 17:00 - 18:00 | 0 | -1300 | 0 | 0 |
| 23.04.2015 18:00 - 19:00 | 0 | -1000 | 0 | 0 |
| 23.04.2015 19:00 - 20:00 | 0 | -1000 | 0 | 0 |
| 23.04.2015 20:00 - 21:00 | 0 | -1300 | 0 | 0 |
| 23.04.2015 21:00 - 22:00 | 0 | -1000 | 0 | 0 |
| 23.04.2015 22:00 - 23:00 | 0 | -1000 | 0 | 0 |
| 23.04.2015 23:00 - 24:00 | 0 | -1000 | 0 | 0 |
| 24.04.2015 00:00 - 01:00 | 0 | -1000 | 0 | 0 |
| 24.04.2015 01:00 - 02:00 | 0 | -1000 | 0 | 0 |
| 24.04.2015 02:00 - 03:00 | 0 | -1000 | 0 | 0 |
| 24.04.2015 03:00 - 04:00 | 0 | -1000 | 0 | 0 |
| 24.04.2015 04:00 - 05:00 | 0 | -1000 | 0 | 0 |
| 24.04.2015 05:00 - 06:00 | 0 | -1000 | 0 | 0 |
| 24.04.2015 06:00 - 07:00 | 0 | 0 | 0 | 0 |
| 24.04.2015 07:00 - 08:00 | 0 | 0 | 0 | 0 |
| 24.04.2015 08:00 - 09:00 | 0 | 0 | 0 | 0 |
| 24.04.2015 09:00 - 10:00 | 0 | 0 | 0 | 0 |
| 24.04.2015 10:00 - 11:00 | 0 | 0 | 0 | 0 |
| 24.04.2015 11:00 - 12:00 | 0 | 0 | 0 | 0 |
| 24.04.2015 12:00 - 13:00 | 0 | 0 | 0 | 0 |
| 24.04.2015 13:00 - 14:00 | 0 | 0 | 0 | 0 |
| 24.04.2015 14:00 - 15:00 | 0 | 0 | 0 | 0 |
| 24.04.2015 15:00 - 16:00 | 0 | 0 | 0 | 0 |
| 24.04.2015 16:00 - 17:00 | 0 | 0 | 0 | 0 |
| 24.04.2015 17:00 - 18:00 | 0 | 0 | 0 | 0 |
| 24.04.2015 18:00 - 19:00 | 0 | 0 | 0 | 0 |
| 24.04.2015 19:00 - 20:00 | 0 | 0 | 0 | 0 |
| 24.04.2015 20:00 - 21:00 | 0 | 0 | 0 | 0 |
| 24.04.2015 21:00 - 22:00 | 0 | 0 | 0 | 0 |
| 24.04.2015 22:00 - 23:00 | 0 | 0 | 0 | 0 |
| 24.04.2015 23:00 - 24:00 | 0 | 0 | 0 | 0 |
| 25.04.2015 00:00 - 01:00 | 460 | 0 | 0 | 0 |
| 25.04.2015 01:00 - 02:00 | 500 | 0 | 0 | 0 |
| 25.04.2015 02:00 - 03:00 | 800 | 0 | 0 | 0 |
| 25.04.2015 03:00 - 04:00 | 800 | 0 | 0 | 0 |
| 25.04.2015 04:00 - 05:00 | 800 | 0 | 0 | 0 |
| 25.04.2015 05:00 - 06:00 | 800 | 0 | 0 | 0 |
| 25.04.2015 06:00 - 07:00 | 0 | 0 | 0 | 0 |
| 25.04.2015 07:00 - 08:00 | 0 | 0 | 0 | 0 |
| 25.04.2015 08:00 - 09:00 | 0 | 0 | 0 | 0 |
| 25.04.2015 09:00 - 10:00 | 0 | 0 | 0 | 0 |
| 25.04.2015 10:00 - 11:00 | 0 | 0 | 0 | 0 |
| 25.04.2015 11:00 - 12:00 | 0 | 0 | 0 | 0 |
| 25.04.2015 12:00 - 13:00 | 0 | 0 | 0 | 0 |
| 25.04.2015 13:00 - 14:00 | 0 | 0 | 0 | 0 |
| 25.04.2015 14:00 - 15:00 | 0 | 0 | 0 | 0 |
| 25.04.2015 15:00 - 16:00 | 0 | 0 | 0 | 0 |
| 25.04.2015 16:00 - 17:00 | 0 | 0 | 0 | 0 |
| 25.04.2015 17:00 - 18:00 | 0 | 0 | 0 | 0 |
| 25.04.2015 18:00 - 19:00 | 0 | 0 | 0 | 0 |
| 25.04.2015 19:00 - 20:00 | 0 | 0 | 0 | 0 |
| 25.04.2015 20:00 - 21:00 | 0 | 0 | 0 | 0 |
| 25.04.2015 21:00 - 22:00 | 0 | 0 | 0 | 0 |
| 25.04.2015 22:00 - 23:00 | 300 | 0 | 0 | 0 |
| 25.04.2015 23:00 - 24:00 | 300 | 0 | 0 | 0 |
| 26.04.2015 00:00 - 01:00 | 652 | 0 | 0 | 0 |
| 26.04.2015 01:00 - 02:00 | 652 | 0 | 0 | 0 |
| 26.04.2015 02:00 - 03:00 | 652 | 0 | 0 | 0 |
| 26.04.2015 03:00 - 04:00 | 652 | 0 | 0 | 0 |
| 26.04.2015 04:00 - 05:00 | 652 | 0 | 0 | 0 |
| 26.04.2015 05:00 - 06:00 | 652 | 0 | 0 | 0 |
| 26.04.2015 06:00 - 07:00 | 0 | 0 | 0 | 0 |
| 26.04.2015 07:00 - 08:00 | 0 | 0 | 0 | 0 |
| 26.04.2015 08:00 - 09:00 | 0 | 0 | 0 | 0 |
| 26.04.2015 09:00 - 10:00 | 0 | 0 | 0 | 0 |
| 26.04.2015 10:00 - 11:00 | 0 | 0 | 0 | 0 |
| 26.04.2015 11:00 - 12:00 | 0 | 0 | 0 | 0 |
| 26.04.2015 12:00 - 13:00 | 0 | 0 | 0 | 0 |
| 26.04.2015 13:00 - 14:00 | 0 | 0 | 0 | 0 |
| 26.04.2015 14:00 - 15:00 | 0 | 0 | 0 | 0 |
| 26.04.2015 15:00 - 16:00 | 0 | 0 | 0 | 0 |
| 26.04.2015 16:00 - 17:00 | 0 | 0 | 0 | 0 |
| 26.04.2015 17:00 - 18:00 | 0 | 0 | 0 | 0 |
| 26.04.2015 18:00 - 19:00 | 0 | -500 | 0 | 0 |
| 26.04.2015 19:00 - 20:00 | 0 | -500 | 0 | 0 |
| 26.04.2015 20:00 - 21:00 | 0 | -500 | 0 | 0 |
| 26.04.2015 21:00 - 22:00 | 0 | -500 | 0 | 0 |
| 26.04.2015 22:00 - 23:00 | 0 | -500 | 0 | 0 |
| 26.04.2015 23:00 - 24:00 | 0 | -750 | 0 | 0 |
| 27.04.2015 00:00 - 01:00 | 0 | -1000 | 0 | 0 |
| 27.04.2015 01:00 - 02:00 | 0 | -1000 | 0 | 0 |
| 27.04.2015 02:00 - 03:00 | 0 | -1000 | 0 | 0 |
| 27.04.2015 03:00 - 04:00 | 0 | -1000 | 0 | 0 |
| 27.04.2015 04:00 - 05:00 | 0 | -1000 | 0 | 0 |
| 27.04.2015 05:00 - 06:00 | 0 | -1000 | 0 | 0 |
| 27.04.2015 06:00 - 07:00 | 0 | 0 | 0 | 0 |
| 27.04.2015 07:00 - 08:00 | 0 | 0 | 0 | 0 |
| 27.04.2015 08:00 - 09:00 | 0 | 0 | 0 | 0 |
| 27.04.2015 09:00 - 10:00 | 0 | 0 | 0 | 0 |
| 27.04.2015 10:00 - 11:00 | 0 | 0 | 0 | 0 |
| 27.04.2015 11:00 - 12:00 | 0 | 0 | 0 | 0 |
| 27.04.2015 12:00 - 13:00 | 0 | 0 | 0 | 0 |
| 27.04.2015 13:00 - 14:00 | 0 | 0 | 0 | 0 |
| 27.04.2015 14:00 - 15:00 | 0 | -200 | 0 | 0 |
| 27.04.2015 15:00 - 16:00 | 0 | -200 | 0 | 0 |
| 27.04.2015 16:00 - 17:00 | 0 | -200 | 0 | 0 |
| 27.04.2015 17:00 - 18:00 | 0 | -200 | 0 | 0 |
| 27.04.2015 18:00 - 19:00 | 0 | -200 | 0 | 0 |
| 27.04.2015 19:00 - 20:00 | 0 | -200 | 0 | 0 |
| 27.04.2015 20:00 - 21:00 | 0 | -200 | 0 | 0 |
| 27.04.2015 21:00 - 22:00 | 0 | -200 | 0 | 0 |
| 27.04.2015 22:00 - 23:00 | 0 | -200 | 0 | 0 |
| 27.04.2015 23:00 - 24:00 | 0 | -200 | 0 | 0 |
| 28.04.2015 00:00 - 01:00 | 0 | -200 | 0 | 0 |
| 28.04.2015 01:00 - 02:00 | 0 | -200 | 0 | 0 |
| 28.04.2015 02:00 - 03:00 | 0 | -200 | 0 | 0 |
| 28.04.2015 03:00 - 04:00 | 0 | -200 | 0 | 0 |
| 28.04.2015 04:00 - 05:00 | 0 | -200 | 0 | 0 |
| 28.04.2015 05:00 - 06:00 | 0 | -200 | 0 | 0 |
| 28.04.2015 06:00 - 07:00 | 0 | 0 | 0 | 0 |
| 28.04.2015 07:00 - 08:00 | 0 | 0 | 0 | 0 |
| 28.04.2015 08:00 - 09:00 | 0 | 0 | 0 | 0 |
| 28.04.2015 09:00 - 10:00 | 0 | 0 | 0 | 0 |
| 28.04.2015 10:00 - 11:00 | 0 | 0 | 0 | 0 |
| 28.04.2015 11:00 - 12:00 | 0 | 0 | 0 | 0 |
| 28.04.2015 12:00 - 13:00 | 0 | 0 | 0 | 0 |
| 28.04.2015 13:00 - 14:00 | 0 | 0 | 0 | 0 |
| 28.04.2015 14:00 - 15:00 | 0 | 0 | 0 | 0 |
| 28.04.2015 15:00 - 16:00 | 0 | 0 | 0 | 0 |
| 28.04.2015 16:00 - 17:00 | 0 | 0 | 0 | 0 |
| 28.04.2015 17:00 - 18:00 | 0 | 0 | 0 | 0 |
| 28.04.2015 18:00 - 19:00 | 0 | 0 | 0 | 0 |
| 28.04.2015 19:00 - 20:00 | 0 | 0 | 0 | 0 |
| 28.04.2015 20:00 - 21:00 | 0 | 0 | 0 | 0 |
| 28.04.2015 21:00 - 22:00 | 0 | 0 | 0 | 0 |
| 28.04.2015 22:00 - 23:00 | 0 | 0 | 0 | 0 |
| 28.04.2015 23:00 - 24:00 | 0 | 0 | 0 | 0 |
| 29.04.2015 00:00 - 01:00 | 0 | 0 | 0 | 0 |
| 29.04.2015 01:00 - 02:00 | 0 | 0 | 0 | 0 |
| 29.04.2015 02:00 - 03:00 | 0 | 0 | 0 | 0 |
| 29.04.2015 03:00 - 04:00 | 0 | 0 | 0 | 0 |
| 29.04.2015 04:00 - 05:00 | 0 | 0 | 0 | 0 |
| 29.04.2015 05:00 - 06:00 | 0 | 0 | 0 | 0 |
| 29.04.2015 06:00 - 07:00 | 0 | 0 | 0 | 0 |
| 29.04.2015 07:00 - 08:00 | 0 | 0 | 0 | 0 |
| 29.04.2015 08:00 - 09:00 | 0 | 0 | 0 | 0 |
| 29.04.2015 09:00 - 10:00 | 0 | 0 | 0 | 0 |
| 29.04.2015 10:00 - 11:00 | 0 | 0 | 0 | 0 |
| 29.04.2015 11:00 - 12:00 | 0 | 0 | 0 | 0 |
| 29.04.2015 12:00 - 13:00 | 0 | 0 | 0 | 0 |
| 29.04.2015 13:00 - 14:00 | 0 | 0 | 0 | 0 |
| 29.04.2015 14:00 - 15:00 | 0 | 0 | 0 | 0 |
| 29.04.2015 15:00 - 16:00 | 0 | 0 | 0 | 0 |
| 29.04.2015 16:00 - 17:00 | 0 | 0 | 0 | 0 |
| 29.04.2015 17:00 - 18:00 | 0 | 0 | 0 | 0 |
| 29.04.2015 18:00 - 19:00 | 0 | 0 | 0 | 0 |
| 29.04.2015 19:00 - 20:00 | 0 | 0 | 0 | 0 |
| 29.04.2015 20:00 - 21:00 | 0 | 0 | 0 | 0 |
| 29.04.2015 21:00 - 22:00 | 0 | 0 | 0 | 0 |
| 29.04.2015 22:00 - 23:00 | 0 | 0 | 0 | 0 |
| 29.04.2015 23:00 - 24:00 | 0 | 0 | 0 | 0 |
| 30.04.2015 00:00 - 01:00 | 0 | 0 | 0 | 0 |
| 30.04.2015 01:00 - 02:00 | 0 | 0 | 0 | 0 |
| 30.04.2015 02:00 - 03:00 | 0 | 0 | 0 | 0 |
| 30.04.2015 03:00 - 04:00 | 0 | 0 | 0 | 0 |
| 30.04.2015 04:00 - 05:00 | 0 | 0 | 0 | 0 |
| 30.04.2015 05:00 - 06:00 | 0 | 0 | 0 | 0 |
| 30.04.2015 06:00 - 07:00 | 0 | 0 | 0 | 0 |
| 30.04.2015 07:00 - 08:00 | 0 | 0 | 0 | 0 |
| 30.04.2015 08:00 - 09:00 | 0 | 0 | 0 | 0 |
| 30.04.2015 09:00 - 10:00 | 0 | 0 | 0 | 0 |
| 30.04.2015 10:00 - 11:00 | 0 | 0 | 0 | 0 |
| 30.04.2015 11:00 - 12:00 | 0 | 0 | 0 | 0 |
| 30.04.2015 12:00 - 13:00 | 0 | 0 | 0 | 0 |
| 30.04.2015 13:00 - 14:00 | 0 | 0 | 0 | 0 |
| 30.04.2015 14:00 - 15:00 | 0 | 0 | 0 | 0 |
| 30.04.2015 15:00 - 16:00 | 0 | 0 | 0 | 0 |
| 30.04.2015 16:00 - 17:00 | 0 | 0 | 0 | 0 |
| 30.04.2015 17:00 - 18:00 | 0 | 0 | 0 | 0 |
| 30.04.2015 18:00 - 19:00 | 0 | 0 | 0 | 0 |
| 30.04.2015 19:00 - 20:00 | 0 | 0 | 0 | 0 |
| 30.04.2015 20:00 - 21:00 | 0 | 0 | 0 | 0 |
| 30.04.2015 21:00 - 22:00 | 0 | 0 | 0 | 0 |
| 30.04.2015 22:00 - 23:00 | 0 | 0 | 0 | 0 |
| 30.04.2015 23:00 - 24:00 | 0 | 0 | 0 | 0 |
| 01.05.2015 00:00 - 01:00 | 0 | 0 | 0 | 0 |
| 01.05.2015 01:00 - 02:00 | 0 | 0 | 0 | 0 |
| 01.05.2015 02:00 - 03:00 | 0 | 0 | 0 | 0 |
| 01.05.2015 03:00 - 04:00 | 0 | 0 | 0 | 0 |
| 01.05.2015 04:00 - 05:00 | 0 | 0 | 0 | 0 |
| 01.05.2015 05:00 - 06:00 | 0 | 0 | 0 | 0 |